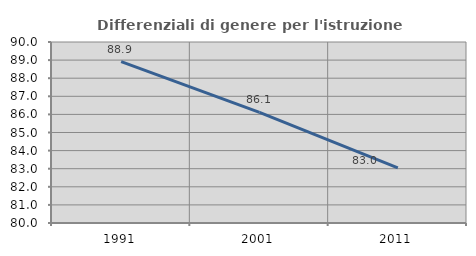
| Category | Differenziali di genere per l'istruzione superiore |
|---|---|
| 1991.0 | 88.92 |
| 2001.0 | 86.109 |
| 2011.0 | 83.047 |